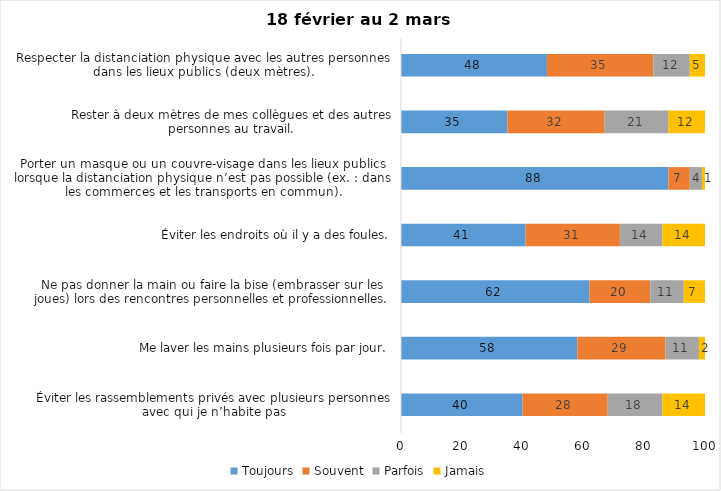
| Category | Toujours | Souvent | Parfois | Jamais |
|---|---|---|---|---|
| Éviter les rassemblements privés avec plusieurs personnes avec qui je n’habite pas | 40 | 28 | 18 | 14 |
| Me laver les mains plusieurs fois par jour. | 58 | 29 | 11 | 2 |
| Ne pas donner la main ou faire la bise (embrasser sur les joues) lors des rencontres personnelles et professionnelles. | 62 | 20 | 11 | 7 |
| Éviter les endroits où il y a des foules. | 41 | 31 | 14 | 14 |
| Porter un masque ou un couvre-visage dans les lieux publics lorsque la distanciation physique n’est pas possible (ex. : dans les commerces et les transports en commun). | 88 | 7 | 4 | 1 |
| Rester à deux mètres de mes collègues et des autres personnes au travail. | 35 | 32 | 21 | 12 |
| Respecter la distanciation physique avec les autres personnes dans les lieux publics (deux mètres). | 48 | 35 | 12 | 5 |